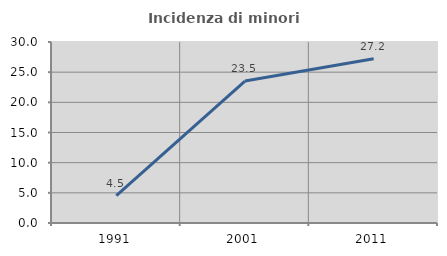
| Category | Incidenza di minori stranieri |
|---|---|
| 1991.0 | 4.545 |
| 2001.0 | 23.529 |
| 2011.0 | 27.235 |